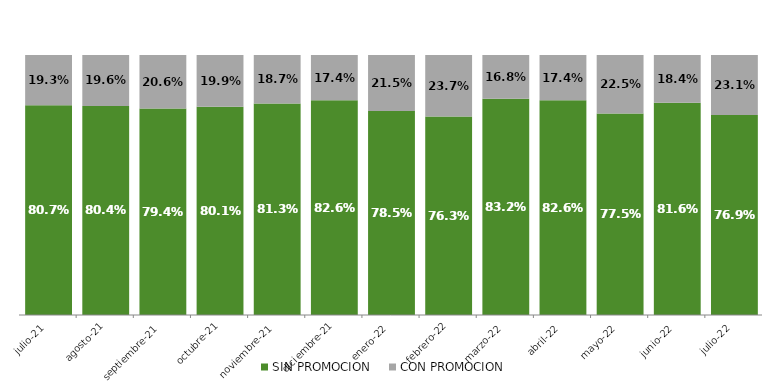
| Category | SIN PROMOCION   | CON PROMOCION   |
|---|---|---|
| 2021-07-01 | 0.807 | 0.193 |
| 2021-08-01 | 0.804 | 0.196 |
| 2021-09-01 | 0.794 | 0.206 |
| 2021-10-01 | 0.801 | 0.199 |
| 2021-11-01 | 0.813 | 0.187 |
| 2021-12-01 | 0.826 | 0.174 |
| 2022-01-01 | 0.785 | 0.215 |
| 2022-02-01 | 0.763 | 0.237 |
| 2022-03-01 | 0.832 | 0.168 |
| 2022-04-01 | 0.826 | 0.174 |
| 2022-05-01 | 0.775 | 0.225 |
| 2022-06-01 | 0.816 | 0.184 |
| 2022-07-01 | 0.769 | 0.231 |